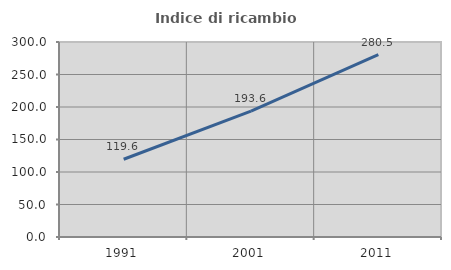
| Category | Indice di ricambio occupazionale  |
|---|---|
| 1991.0 | 119.627 |
| 2001.0 | 193.575 |
| 2011.0 | 280.486 |